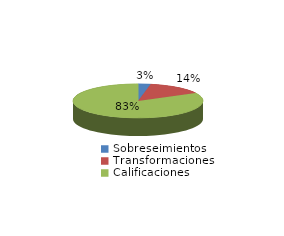
| Category | Series 0 |
|---|---|
| Sobreseimientos | 7 |
| Transformaciones | 32 |
| Calificaciones | 187 |